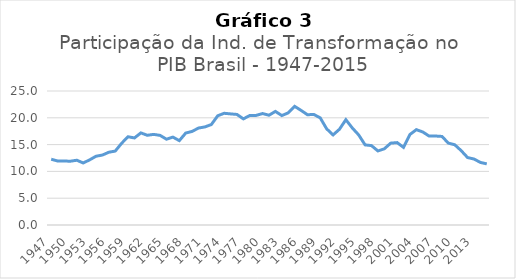
| Category | Series 0 |
|---|---|
| 1947.0 | 12.272 |
| 1948.0 | 11.941 |
| 1949.0 | 11.935 |
| 1950.0 | 11.901 |
| 1951.0 | 12.084 |
| 1952.0 | 11.573 |
| 1953.0 | 12.156 |
| 1954.0 | 12.829 |
| 1955.0 | 13.053 |
| 1956.0 | 13.578 |
| 1957.0 | 13.793 |
| 1958.0 | 15.257 |
| 1959.0 | 16.461 |
| 1960.0 | 16.243 |
| 1961.0 | 17.184 |
| 1962.0 | 16.739 |
| 1963.0 | 16.906 |
| 1964.0 | 16.72 |
| 1965.0 | 16.006 |
| 1966.0 | 16.397 |
| 1967.0 | 15.741 |
| 1968.0 | 17.154 |
| 1969.0 | 17.463 |
| 1970.0 | 18.089 |
| 1971.0 | 18.302 |
| 1972.0 | 18.742 |
| 1973.0 | 20.381 |
| 1974.0 | 20.843 |
| 1975.0 | 20.728 |
| 1976.0 | 20.627 |
| 1977.0 | 19.798 |
| 1978.0 | 20.436 |
| 1979.0 | 20.451 |
| 1980.0 | 20.794 |
| 1981.0 | 20.477 |
| 1982.0 | 21.195 |
| 1983.0 | 20.416 |
| 1984.0 | 20.919 |
| 1985.0 | 22.139 |
| 1986.0 | 21.387 |
| 1987.0 | 20.575 |
| 1988.0 | 20.623 |
| 1989.0 | 19.984 |
| 1990.0 | 17.942 |
| 1991.0 | 16.804 |
| 1992.0 | 17.863 |
| 1993.0 | 19.643 |
| 1994.0 | 18.108 |
| 1995.0 | 16.809 |
| 1996.0 | 14.946 |
| 1997.0 | 14.813 |
| 1998.0 | 13.815 |
| 1999.0 | 14.214 |
| 2000.0 | 15.271 |
| 2001.0 | 15.372 |
| 2002.0 | 14.483 |
| 2003.0 | 16.88 |
| 2004.0 | 17.787 |
| 2005.0 | 17.36 |
| 2006.0 | 16.589 |
| 2007.0 | 16.6 |
| 2008.0 | 16.523 |
| 2009.0 | 15.274 |
| 2010.0 | 14.967 |
| 2011.0 | 13.871 |
| 2012.0 | 12.582 |
| 2013.0 | 12.311 |
| 2014.0 | 11.673 |
| 2015.0 | 11.402 |